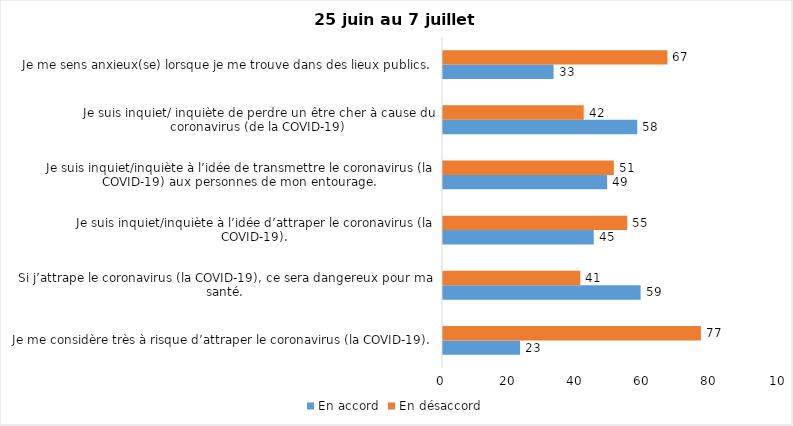
| Category | En accord | En désaccord |
|---|---|---|
| Je me considère très à risque d’attraper le coronavirus (la COVID-19). | 23 | 77 |
| Si j’attrape le coronavirus (la COVID-19), ce sera dangereux pour ma santé. | 59 | 41 |
| Je suis inquiet/inquiète à l’idée d’attraper le coronavirus (la COVID-19). | 45 | 55 |
| Je suis inquiet/inquiète à l’idée de transmettre le coronavirus (la COVID-19) aux personnes de mon entourage. | 49 | 51 |
| Je suis inquiet/ inquiète de perdre un être cher à cause du coronavirus (de la COVID-19) | 58 | 42 |
| Je me sens anxieux(se) lorsque je me trouve dans des lieux publics. | 33 | 67 |